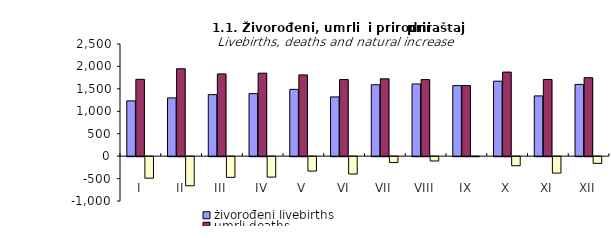
| Category | živorođeni livebirths | umrli deaths | prirodni priraštaj natural increase |
|---|---|---|---|
| I | 1232 | 1712 | -480 |
| II | 1298 | 1948 | -650 |
| III | 1371 | 1833 | -462 |
| IV | 1394 | 1850 | -456 |
| V | 1489 | 1811 | -322 |
| VI | 1320 | 1707 | -387 |
| VII | 1592 | 1724 | -132 |
| VIII | 1609 | 1706 | -97 |
| IX | 1572 | 1574 | -2 |
| X | 1671 | 1874 | -203 |
| XI | 1343 | 1710 | -367 |
| XII | 1599 | 1749 | -150 |